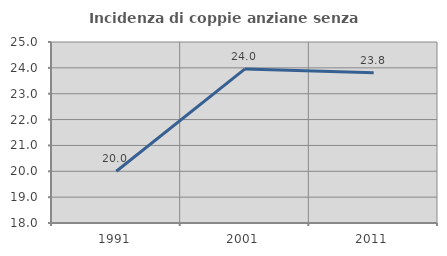
| Category | Incidenza di coppie anziane senza figli  |
|---|---|
| 1991.0 | 20 |
| 2001.0 | 23.958 |
| 2011.0 | 23.81 |